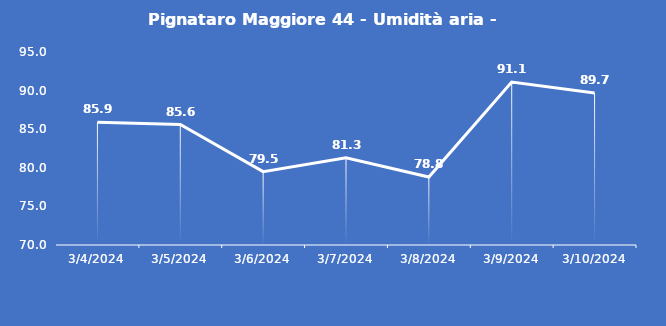
| Category | Pignataro Maggiore 44 - Umidità aria - Grezzo (%) |
|---|---|
| 3/4/24 | 85.9 |
| 3/5/24 | 85.6 |
| 3/6/24 | 79.5 |
| 3/7/24 | 81.3 |
| 3/8/24 | 78.8 |
| 3/9/24 | 91.1 |
| 3/10/24 | 89.7 |